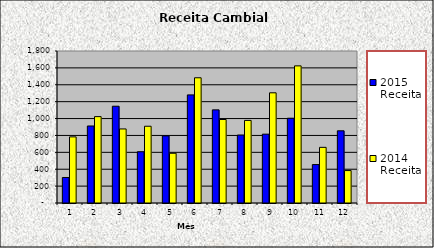
| Category | 2015 Receita | 2014 Receita |
|---|---|---|
| 0 | 302 | 783 |
| 1 | 912 | 1023 |
| 2 | 1146 | 877 |
| 3 | 607 | 909 |
| 4 | 795 | 589 |
| 5 | 1280 | 1483 |
| 6 | 1103 | 989 |
| 7 | 804.887 | 978 |
| 8 | 815.2 | 1305 |
| 9 | 1003.873 | 1624 |
| 10 | 455 | 659 |
| 11 | 855 | 384 |